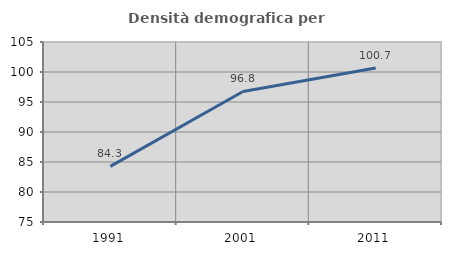
| Category | Densità demografica |
|---|---|
| 1991.0 | 84.262 |
| 2001.0 | 96.754 |
| 2011.0 | 100.674 |